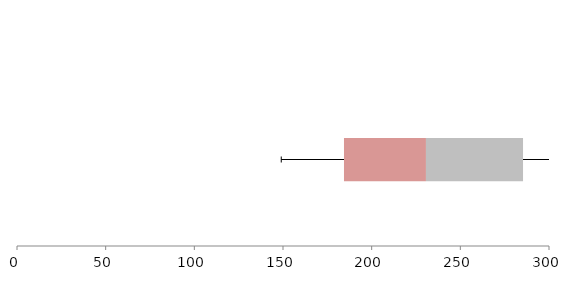
| Category | Series 1 | Series 2 | Series 3 |
|---|---|---|---|
| 0 | 184.39 | 46.224 | 54.737 |